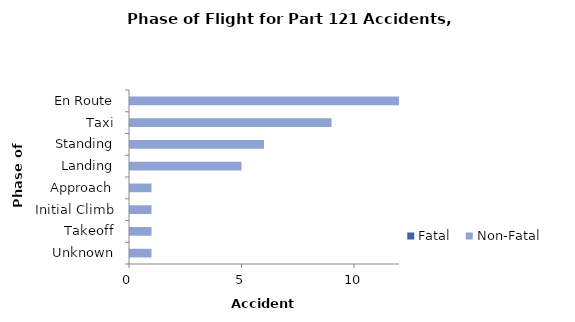
| Category | Fatal | Non-Fatal |
|---|---|---|
| En Route | 0 | 12 |
| Taxi | 0 | 9 |
| Standing | 0 | 6 |
| Landing | 0 | 5 |
| Approach | 0 | 1 |
| Initial Climb | 0 | 1 |
| Takeoff | 0 | 1 |
| Unknown | 0 | 1 |